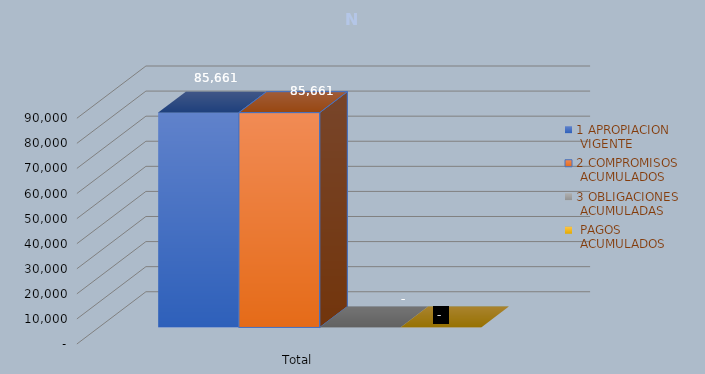
| Category | 1 APROPIACION
 VIGENTE | 2 COMPROMISOS
 ACUMULADOS | 3 OBLIGACIONES
 ACUMULADAS |  PAGOS
 ACUMULADOS |
|---|---|---|---|---|
| Total | 85660.554 | 85660.554 | 0 | 0 |